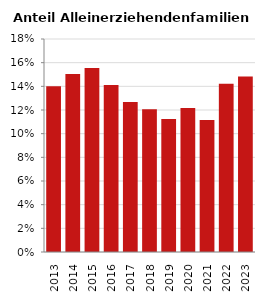
| Category | Anteil Alleinerziehende an Familien |
|---|---|
| 2013.0 | 0.14 |
| 2014.0 | 0.15 |
| 2015.0 | 0.156 |
| 2016.0 | 0.141 |
| 2017.0 | 0.127 |
| 2018.0 | 0.121 |
| 2019.0 | 0.112 |
| 2020.0 | 0.122 |
| 2021.0 | 0.112 |
| 2022.0 | 0.142 |
| 2023.0 | 0.148 |